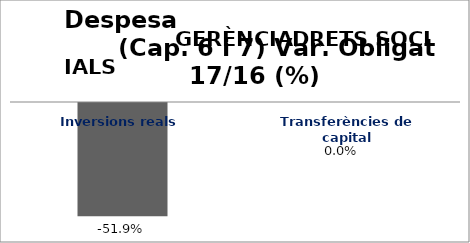
| Category | Series 0 |
|---|---|
| Inversions reals | -0.519 |
| Transferències de capital | 0 |